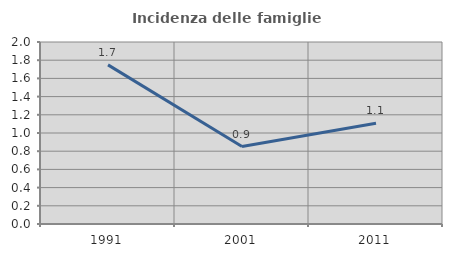
| Category | Incidenza delle famiglie numerose |
|---|---|
| 1991.0 | 1.748 |
| 2001.0 | 0.851 |
| 2011.0 | 1.108 |